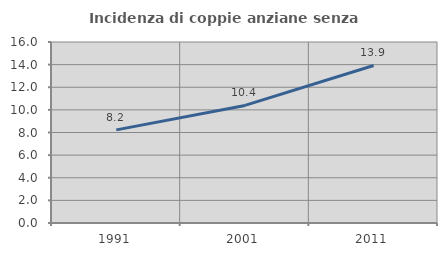
| Category | Incidenza di coppie anziane senza figli  |
|---|---|
| 1991.0 | 8.23 |
| 2001.0 | 10.394 |
| 2011.0 | 13.924 |